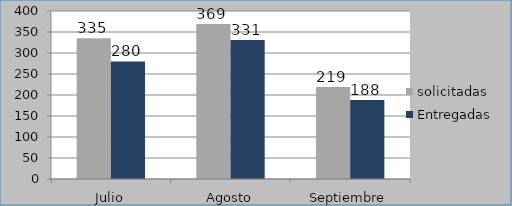
| Category | solicitadas | Entregadas |
|---|---|---|
| Julio | 335 | 280 |
| Agosto | 369 | 331 |
| Septiembre | 219 | 188 |